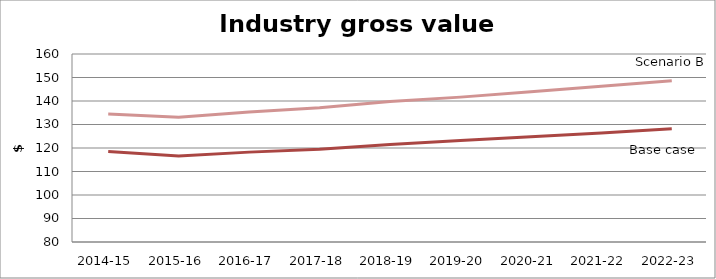
| Category | Base case | Scenario B |
|---|---|---|
| 2014-15 | 118.472 | 134.49 |
| 2015-16 | 116.561 | 133.093 |
| 2016-17 | 118.245 | 135.355 |
| 2017-18 | 119.436 | 137.119 |
| 2018-19 | 121.49 | 139.83 |
| 2019-20 | 123.143 | 141.648 |
| 2020-21 | 124.789 | 143.968 |
| 2021-22 | 126.425 | 146.234 |
| 2022-23 | 128.173 | 148.585 |